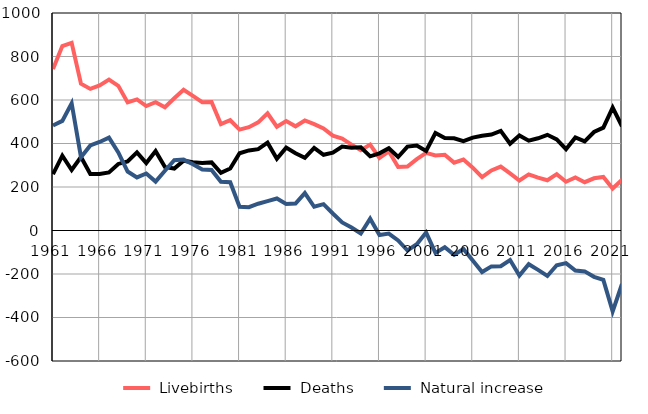
| Category |  Livebirths |  Deaths |  Natural increase |
|---|---|---|---|
| 1961.0 | 742 | 259 | 483 |
| 1962.0 | 848 | 344 | 504 |
| 1963.0 | 863 | 278 | 585 |
| 1964.0 | 675 | 338 | 337 |
| 1965.0 | 651 | 260 | 391 |
| 1966.0 | 667 | 260 | 407 |
| 1967.0 | 694 | 267 | 427 |
| 1968.0 | 665 | 306 | 359 |
| 1969.0 | 589 | 318 | 271 |
| 1970.0 | 603 | 359 | 244 |
| 1971.0 | 572 | 310 | 262 |
| 1972.0 | 590 | 365 | 225 |
| 1973.0 | 567 | 292 | 275 |
| 1974.0 | 608 | 285 | 323 |
| 1975.0 | 647 | 321 | 326 |
| 1976.0 | 619 | 314 | 305 |
| 1977.0 | 590 | 310 | 280 |
| 1978.0 | 591 | 313 | 278 |
| 1979.0 | 489 | 265 | 224 |
| 1980.0 | 507 | 285 | 222 |
| 1981.0 | 464 | 355 | 109 |
| 1982.0 | 475 | 368 | 107 |
| 1983.0 | 497 | 374 | 123 |
| 1984.0 | 539 | 404 | 135 |
| 1985.0 | 477 | 330 | 147 |
| 1986.0 | 503 | 381 | 122 |
| 1987.0 | 479 | 355 | 124 |
| 1988.0 | 506 | 334 | 172 |
| 1989.0 | 489 | 380 | 109 |
| 1990.0 | 469 | 348 | 121 |
| 1991.0 | 436 | 358 | 78 |
| 1992.0 | 423 | 386 | 37 |
| 1993.0 | 395 | 381 | 14 |
| 1994.0 | 369 | 383 | -14 |
| 1995.0 | 395 | 341 | 54 |
| 1996.0 | 334 | 355 | -21 |
| 1997.0 | 364 | 378 | -14 |
| 1998.0 | 292 | 338 | -46 |
| 1999.0 | 294 | 386 | -92 |
| 2000.0 | 328 | 391 | -63 |
| 2001.0 | 357 | 366 | -9 |
| 2002.0 | 345 | 448 | -103 |
| 2003.0 | 348 | 425 | -77 |
| 2004.0 | 312 | 424 | -112 |
| 2005.0 | 326 | 411 | -85 |
| 2006.0 | 289 | 427 | -138 |
| 2007.0 | 245 | 436 | -191 |
| 2008.0 | 276 | 441 | -165 |
| 2009.0 | 294 | 458 | -164 |
| 2010.0 | 263 | 399 | -136 |
| 2011.0 | 230 | 437 | -207 |
| 2012.0 | 258 | 413 | -155 |
| 2013.0 | 243 | 424 | -181 |
| 2014.0 | 231 | 440 | -209 |
| 2015.0 | 259 | 419 | -160 |
| 2016.0 | 224 | 374 | -150 |
| 2017.0 | 244 | 428 | -184 |
| 2018.0 | 222 | 410 | -188 |
| 2019.0 | 240 | 453 | -213 |
| 2020.0 | 246 | 473 | -227 |
| 2021.0 | 193 | 565 | -372 |
| 2022.0 | 233 | 479 | -246 |